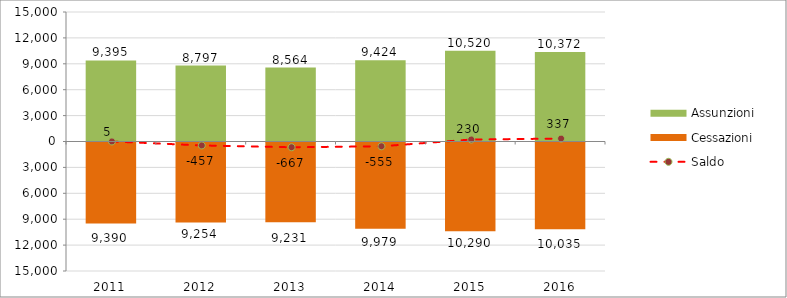
| Category | Assunzioni | Cessazioni |
|---|---|---|
| 2011.0 | 9395 | -9390 |
| 2012.0 | 8797 | -9254 |
| 2013.0 | 8564 | -9231 |
| 2014.0 | 9424 | -9979 |
| 2015.0 | 10520 | -10290 |
| 2016.0 | 10372 | -10035 |